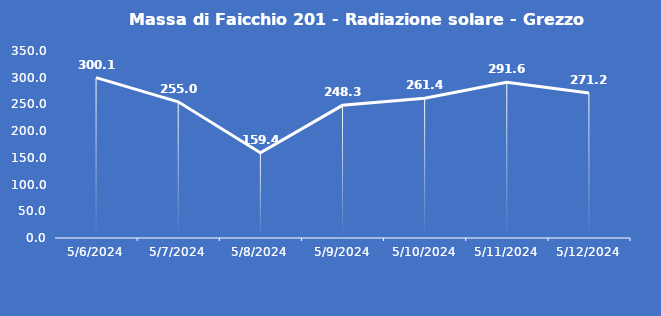
| Category | Massa di Faicchio 201 - Radiazione solare - Grezzo (W/m2) |
|---|---|
| 5/6/24 | 300.1 |
| 5/7/24 | 255 |
| 5/8/24 | 159.4 |
| 5/9/24 | 248.3 |
| 5/10/24 | 261.4 |
| 5/11/24 | 291.6 |
| 5/12/24 | 271.2 |